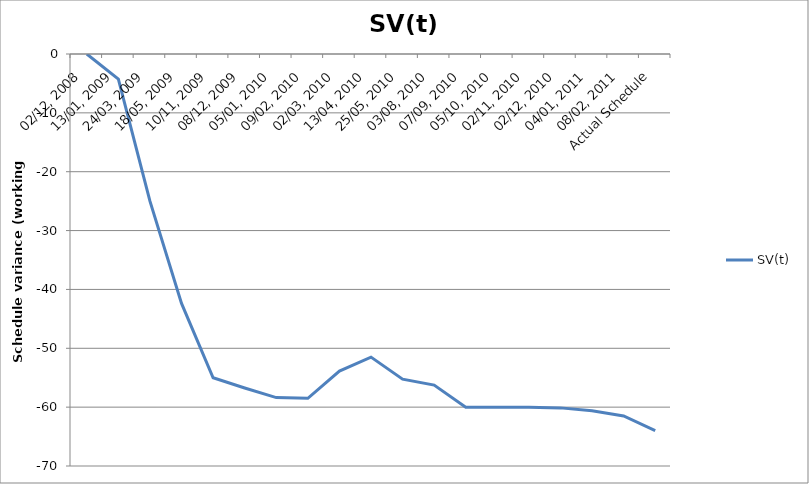
| Category | SV(t) |
|---|---|
| 02/12, 2008 | 0 |
| 13/01, 2009 | -4.25 |
| 24/03, 2009 | -25 |
| 18/05, 2009 | -42.375 |
| 10/11, 2009 | -55 |
| 08/12, 2009 | -56.75 |
| 05/01, 2010 | -58.375 |
| 09/02, 2010 | -58.5 |
| 02/03, 2010 | -53.875 |
| 13/04, 2010 | -51.5 |
| 25/05, 2010 | -55.25 |
| 03/08, 2010 | -56.25 |
| 07/09, 2010 | -60 |
| 05/10, 2010 | -60 |
| 02/11, 2010 | -60 |
| 02/12, 2010 | -60.125 |
| 04/01, 2011 | -60.625 |
| 08/02, 2011 | -61.5 |
| Actual Schedule | -64 |